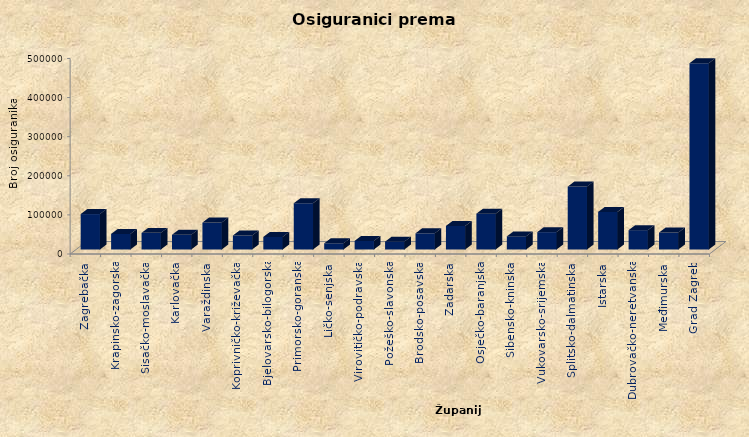
| Category | Series 0 |
|---|---|
| Zagrebačka | 90576 |
| Krapinsko-zagorska | 39758 |
| Sisačko-moslavačka | 42527 |
| Karlovačka | 37625 |
| Varaždinska | 68911 |
| Koprivničko-križevačka | 35775 |
| Bjelovarsko-bilogorska | 32105 |
| Primorsko-goranska | 118210 |
| Ličko-senjska | 15884 |
| Virovitičko-podravska | 22013 |
| Požeško-slavonska | 20066 |
| Brodsko-posavska | 41414 |
| Zadarska | 60235 |
| Osječko-baranjska | 91620 |
| Šibensko-kninska | 33520 |
| Vukovarsko-srijemska | 44445 |
| Splitsko-dalmatinska | 160839 |
| Istarska | 96142 |
| Dubrovačko-neretvanska | 49451 |
| Međimurska | 43358 |
| Grad Zagreb | 476317 |